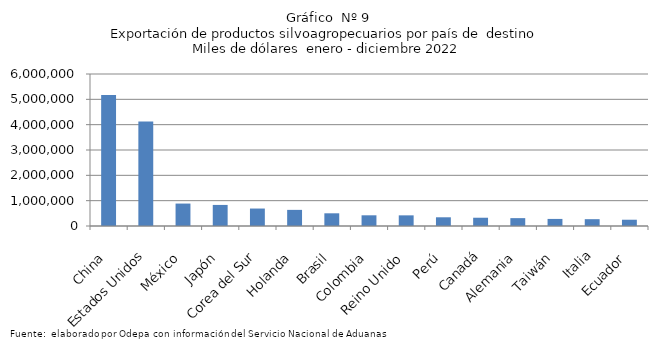
| Category | Series 0 |
|---|---|
| China | 5174138.022 |
| Estados Unidos | 4128607.784 |
| México | 885607.12 |
| Japón | 831608.391 |
| Corea del Sur | 689267.441 |
| Holanda | 636462.193 |
| Brasil | 501186.517 |
| Colombia | 422206.676 |
| Reino Unido | 420415.661 |
| Perú | 343883.698 |
| Canadá | 326317.911 |
| Alemania | 310608.478 |
| Taiwán | 279349.736 |
| Italia | 269224.082 |
| Ecuador | 247503.926 |